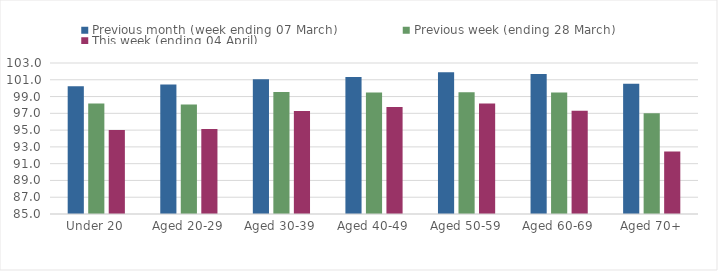
| Category | Previous month (week ending 07 March) | Previous week (ending 28 March) | This week (ending 04 April) |
|---|---|---|---|
| Under 20 | 100.229 | 98.167 | 95.003 |
| Aged 20-29 | 100.445 | 98.054 | 95.141 |
| Aged 30-39 | 101.074 | 99.542 | 97.27 |
| Aged 40-49 | 101.337 | 99.495 | 97.764 |
| Aged 50-59 | 101.911 | 99.519 | 98.161 |
| Aged 60-69 | 101.695 | 99.475 | 97.295 |
| Aged 70+ | 100.538 | 96.996 | 92.455 |